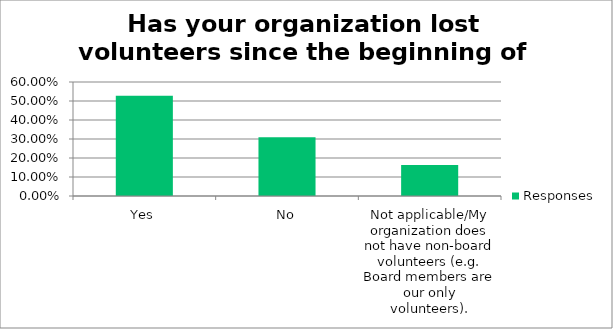
| Category | Responses |
|---|---|
| Yes | 0.528 |
| No | 0.309 |
| Not applicable/My organization does not have non-board volunteers (e.g. Board members are our only volunteers). | 0.164 |